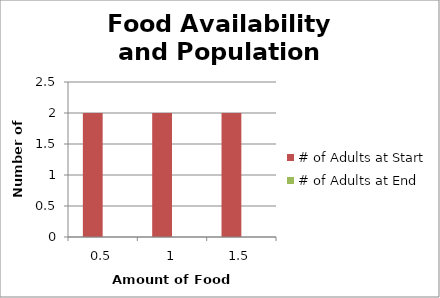
| Category | # of Adults at Start | # of Adults at End |
|---|---|---|
| 0.5 | 2 |  |
| 1.0 | 2 |  |
| 1.5 | 2 |  |